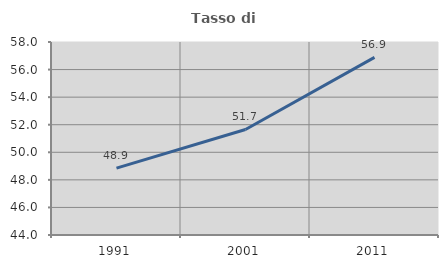
| Category | Tasso di occupazione   |
|---|---|
| 1991.0 | 48.854 |
| 2001.0 | 51.657 |
| 2011.0 | 56.886 |